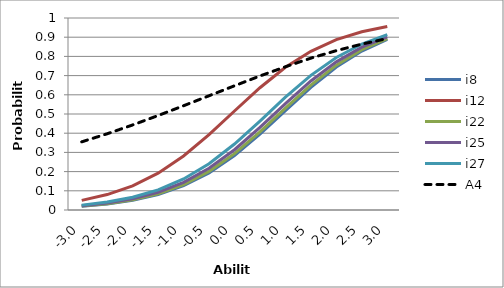
| Category | i8 | i12 | i22 | i25 | i27 | A4 |
|---|---|---|---|---|---|---|
| -3.0 | 0.019 | 0.05 | 0.02 | 0.022 | 0.025 | 0.355 |
| -2.5 | 0.031 | 0.08 | 0.033 | 0.036 | 0.041 | 0.397 |
| -2.0 | 0.051 | 0.126 | 0.053 | 0.058 | 0.066 | 0.443 |
| -1.5 | 0.081 | 0.192 | 0.085 | 0.093 | 0.105 | 0.492 |
| -1.0 | 0.127 | 0.281 | 0.133 | 0.144 | 0.162 | 0.543 |
| -0.5 | 0.193 | 0.392 | 0.201 | 0.217 | 0.241 | 0.595 |
| 0.0 | 0.283 | 0.515 | 0.294 | 0.314 | 0.344 | 0.647 |
| 0.5 | 0.395 | 0.637 | 0.407 | 0.43 | 0.463 | 0.698 |
| 1.0 | 0.518 | 0.743 | 0.53 | 0.554 | 0.587 | 0.746 |
| 1.5 | 0.639 | 0.827 | 0.651 | 0.672 | 0.701 | 0.791 |
| 2.0 | 0.745 | 0.887 | 0.754 | 0.772 | 0.795 | 0.83 |
| 2.5 | 0.828 | 0.928 | 0.835 | 0.848 | 0.864 | 0.864 |
| 3.0 | 0.888 | 0.955 | 0.893 | 0.902 | 0.913 | 0.893 |